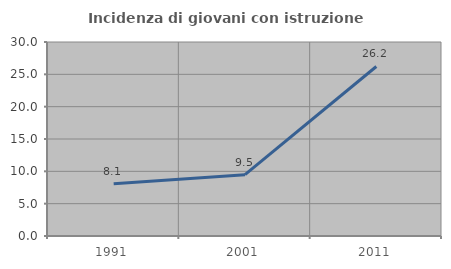
| Category | Incidenza di giovani con istruzione universitaria |
|---|---|
| 1991.0 | 8.088 |
| 2001.0 | 9.483 |
| 2011.0 | 26.214 |